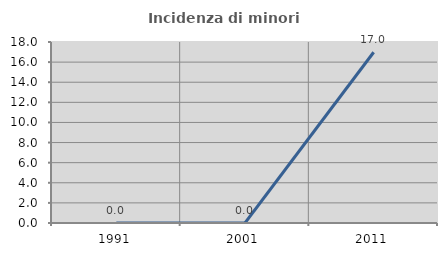
| Category | Incidenza di minori stranieri |
|---|---|
| 1991.0 | 0 |
| 2001.0 | 0 |
| 2011.0 | 16.981 |